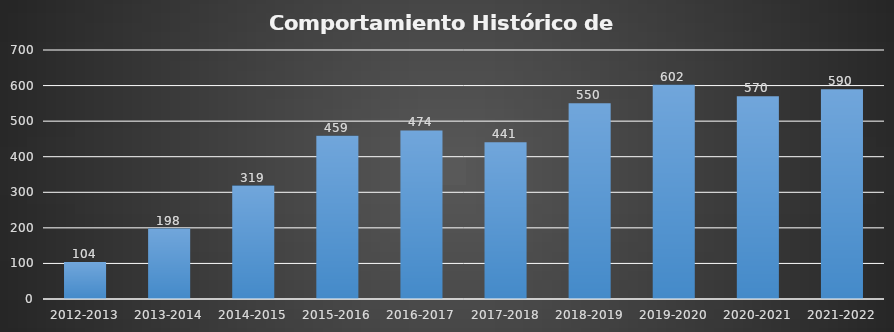
| Category | Series 0 |
|---|---|
| 2012-2013 | 104 |
| 2013-2014 | 198 |
| 2014-2015 | 319 |
| 2015-2016 | 459 |
| 2016-2017 | 474 |
| 2017-2018 | 441 |
| 2018-2019 | 550 |
| 2019-2020 | 602 |
| 2020-2021 | 570 |
| 2021-2022 | 590 |